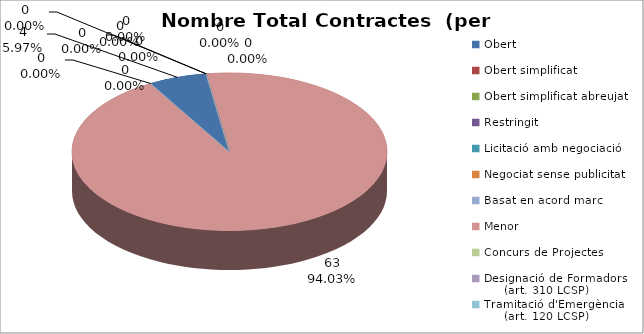
| Category | Nombre Total Contractes |
|---|---|
| Obert | 4 |
| Obert simplificat | 0 |
| Obert simplificat abreujat | 0 |
| Restringit | 0 |
| Licitació amb negociació | 0 |
| Negociat sense publicitat | 0 |
| Basat en acord marc | 0 |
| Menor | 63 |
| Concurs de Projectes | 0 |
| Designació de Formadors
     (art. 310 LCSP) | 0 |
| Tramitació d'Emergència
     (art. 120 LCSP) | 0 |